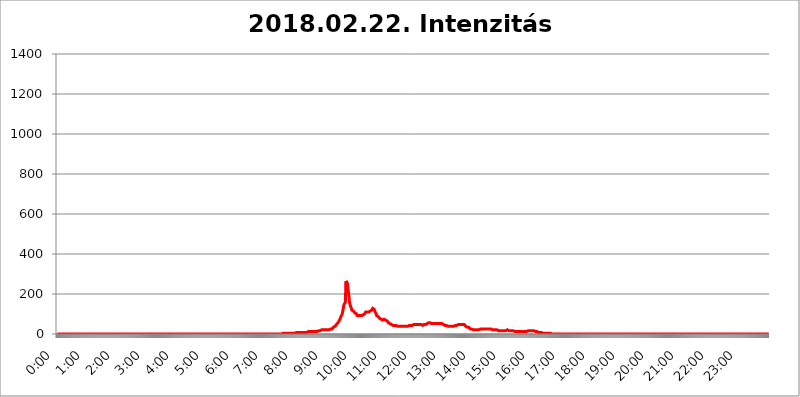
| Category | 2018.02.22. Intenzitás [W/m^2] |
|---|---|
| 0.0 | 0 |
| 0.0006944444444444445 | 0 |
| 0.001388888888888889 | 0 |
| 0.0020833333333333333 | 0 |
| 0.002777777777777778 | 0 |
| 0.003472222222222222 | 0 |
| 0.004166666666666667 | 0 |
| 0.004861111111111111 | 0 |
| 0.005555555555555556 | 0 |
| 0.0062499999999999995 | 0 |
| 0.006944444444444444 | 0 |
| 0.007638888888888889 | 0 |
| 0.008333333333333333 | 0 |
| 0.009027777777777779 | 0 |
| 0.009722222222222222 | 0 |
| 0.010416666666666666 | 0 |
| 0.011111111111111112 | 0 |
| 0.011805555555555555 | 0 |
| 0.012499999999999999 | 0 |
| 0.013194444444444444 | 0 |
| 0.013888888888888888 | 0 |
| 0.014583333333333332 | 0 |
| 0.015277777777777777 | 0 |
| 0.015972222222222224 | 0 |
| 0.016666666666666666 | 0 |
| 0.017361111111111112 | 0 |
| 0.018055555555555557 | 0 |
| 0.01875 | 0 |
| 0.019444444444444445 | 0 |
| 0.02013888888888889 | 0 |
| 0.020833333333333332 | 0 |
| 0.02152777777777778 | 0 |
| 0.022222222222222223 | 0 |
| 0.02291666666666667 | 0 |
| 0.02361111111111111 | 0 |
| 0.024305555555555556 | 0 |
| 0.024999999999999998 | 0 |
| 0.025694444444444447 | 0 |
| 0.02638888888888889 | 0 |
| 0.027083333333333334 | 0 |
| 0.027777777777777776 | 0 |
| 0.02847222222222222 | 0 |
| 0.029166666666666664 | 0 |
| 0.029861111111111113 | 0 |
| 0.030555555555555555 | 0 |
| 0.03125 | 0 |
| 0.03194444444444445 | 0 |
| 0.03263888888888889 | 0 |
| 0.03333333333333333 | 0 |
| 0.034027777777777775 | 0 |
| 0.034722222222222224 | 0 |
| 0.035416666666666666 | 0 |
| 0.036111111111111115 | 0 |
| 0.03680555555555556 | 0 |
| 0.0375 | 0 |
| 0.03819444444444444 | 0 |
| 0.03888888888888889 | 0 |
| 0.03958333333333333 | 0 |
| 0.04027777777777778 | 0 |
| 0.04097222222222222 | 0 |
| 0.041666666666666664 | 0 |
| 0.042361111111111106 | 0 |
| 0.04305555555555556 | 0 |
| 0.043750000000000004 | 0 |
| 0.044444444444444446 | 0 |
| 0.04513888888888889 | 0 |
| 0.04583333333333334 | 0 |
| 0.04652777777777778 | 0 |
| 0.04722222222222222 | 0 |
| 0.04791666666666666 | 0 |
| 0.04861111111111111 | 0 |
| 0.049305555555555554 | 0 |
| 0.049999999999999996 | 0 |
| 0.05069444444444445 | 0 |
| 0.051388888888888894 | 0 |
| 0.052083333333333336 | 0 |
| 0.05277777777777778 | 0 |
| 0.05347222222222222 | 0 |
| 0.05416666666666667 | 0 |
| 0.05486111111111111 | 0 |
| 0.05555555555555555 | 0 |
| 0.05625 | 0 |
| 0.05694444444444444 | 0 |
| 0.057638888888888885 | 0 |
| 0.05833333333333333 | 0 |
| 0.05902777777777778 | 0 |
| 0.059722222222222225 | 0 |
| 0.06041666666666667 | 0 |
| 0.061111111111111116 | 0 |
| 0.06180555555555556 | 0 |
| 0.0625 | 0 |
| 0.06319444444444444 | 0 |
| 0.06388888888888888 | 0 |
| 0.06458333333333334 | 0 |
| 0.06527777777777778 | 0 |
| 0.06597222222222222 | 0 |
| 0.06666666666666667 | 0 |
| 0.06736111111111111 | 0 |
| 0.06805555555555555 | 0 |
| 0.06874999999999999 | 0 |
| 0.06944444444444443 | 0 |
| 0.07013888888888889 | 0 |
| 0.07083333333333333 | 0 |
| 0.07152777777777779 | 0 |
| 0.07222222222222223 | 0 |
| 0.07291666666666667 | 0 |
| 0.07361111111111111 | 0 |
| 0.07430555555555556 | 0 |
| 0.075 | 0 |
| 0.07569444444444444 | 0 |
| 0.0763888888888889 | 0 |
| 0.07708333333333334 | 0 |
| 0.07777777777777778 | 0 |
| 0.07847222222222222 | 0 |
| 0.07916666666666666 | 0 |
| 0.0798611111111111 | 0 |
| 0.08055555555555556 | 0 |
| 0.08125 | 0 |
| 0.08194444444444444 | 0 |
| 0.08263888888888889 | 0 |
| 0.08333333333333333 | 0 |
| 0.08402777777777777 | 0 |
| 0.08472222222222221 | 0 |
| 0.08541666666666665 | 0 |
| 0.08611111111111112 | 0 |
| 0.08680555555555557 | 0 |
| 0.08750000000000001 | 0 |
| 0.08819444444444445 | 0 |
| 0.08888888888888889 | 0 |
| 0.08958333333333333 | 0 |
| 0.09027777777777778 | 0 |
| 0.09097222222222222 | 0 |
| 0.09166666666666667 | 0 |
| 0.09236111111111112 | 0 |
| 0.09305555555555556 | 0 |
| 0.09375 | 0 |
| 0.09444444444444444 | 0 |
| 0.09513888888888888 | 0 |
| 0.09583333333333333 | 0 |
| 0.09652777777777777 | 0 |
| 0.09722222222222222 | 0 |
| 0.09791666666666667 | 0 |
| 0.09861111111111111 | 0 |
| 0.09930555555555555 | 0 |
| 0.09999999999999999 | 0 |
| 0.10069444444444443 | 0 |
| 0.1013888888888889 | 0 |
| 0.10208333333333335 | 0 |
| 0.10277777777777779 | 0 |
| 0.10347222222222223 | 0 |
| 0.10416666666666667 | 0 |
| 0.10486111111111111 | 0 |
| 0.10555555555555556 | 0 |
| 0.10625 | 0 |
| 0.10694444444444444 | 0 |
| 0.1076388888888889 | 0 |
| 0.10833333333333334 | 0 |
| 0.10902777777777778 | 0 |
| 0.10972222222222222 | 0 |
| 0.1111111111111111 | 0 |
| 0.11180555555555556 | 0 |
| 0.11180555555555556 | 0 |
| 0.1125 | 0 |
| 0.11319444444444444 | 0 |
| 0.11388888888888889 | 0 |
| 0.11458333333333333 | 0 |
| 0.11527777777777777 | 0 |
| 0.11597222222222221 | 0 |
| 0.11666666666666665 | 0 |
| 0.1173611111111111 | 0 |
| 0.11805555555555557 | 0 |
| 0.11944444444444445 | 0 |
| 0.12013888888888889 | 0 |
| 0.12083333333333333 | 0 |
| 0.12152777777777778 | 0 |
| 0.12222222222222223 | 0 |
| 0.12291666666666667 | 0 |
| 0.12291666666666667 | 0 |
| 0.12361111111111112 | 0 |
| 0.12430555555555556 | 0 |
| 0.125 | 0 |
| 0.12569444444444444 | 0 |
| 0.12638888888888888 | 0 |
| 0.12708333333333333 | 0 |
| 0.16875 | 0 |
| 0.12847222222222224 | 0 |
| 0.12916666666666668 | 0 |
| 0.12986111111111112 | 0 |
| 0.13055555555555556 | 0 |
| 0.13125 | 0 |
| 0.13194444444444445 | 0 |
| 0.1326388888888889 | 0 |
| 0.13333333333333333 | 0 |
| 0.13402777777777777 | 0 |
| 0.13402777777777777 | 0 |
| 0.13472222222222222 | 0 |
| 0.13541666666666666 | 0 |
| 0.1361111111111111 | 0 |
| 0.13749999999999998 | 0 |
| 0.13819444444444443 | 0 |
| 0.1388888888888889 | 0 |
| 0.13958333333333334 | 0 |
| 0.14027777777777778 | 0 |
| 0.14097222222222222 | 0 |
| 0.14166666666666666 | 0 |
| 0.1423611111111111 | 0 |
| 0.14305555555555557 | 0 |
| 0.14375000000000002 | 0 |
| 0.14444444444444446 | 0 |
| 0.1451388888888889 | 0 |
| 0.1451388888888889 | 0 |
| 0.14652777777777778 | 0 |
| 0.14722222222222223 | 0 |
| 0.14791666666666667 | 0 |
| 0.1486111111111111 | 0 |
| 0.14930555555555555 | 0 |
| 0.15 | 0 |
| 0.15069444444444444 | 0 |
| 0.15138888888888888 | 0 |
| 0.15208333333333332 | 0 |
| 0.15277777777777776 | 0 |
| 0.15347222222222223 | 0 |
| 0.15416666666666667 | 0 |
| 0.15486111111111112 | 0 |
| 0.15555555555555556 | 0 |
| 0.15625 | 0 |
| 0.15694444444444444 | 0 |
| 0.15763888888888888 | 0 |
| 0.15833333333333333 | 0 |
| 0.15902777777777777 | 0 |
| 0.15972222222222224 | 0 |
| 0.16041666666666668 | 0 |
| 0.16111111111111112 | 0 |
| 0.16180555555555556 | 0 |
| 0.1625 | 0 |
| 0.16319444444444445 | 0 |
| 0.1638888888888889 | 0 |
| 0.16458333333333333 | 0 |
| 0.16527777777777777 | 0 |
| 0.16597222222222222 | 0 |
| 0.16666666666666666 | 0 |
| 0.1673611111111111 | 0 |
| 0.16805555555555554 | 0 |
| 0.16874999999999998 | 0 |
| 0.16944444444444443 | 0 |
| 0.17013888888888887 | 0 |
| 0.1708333333333333 | 0 |
| 0.17152777777777775 | 0 |
| 0.17222222222222225 | 0 |
| 0.1729166666666667 | 0 |
| 0.17361111111111113 | 0 |
| 0.17430555555555557 | 0 |
| 0.17500000000000002 | 0 |
| 0.17569444444444446 | 0 |
| 0.1763888888888889 | 0 |
| 0.17708333333333334 | 0 |
| 0.17777777777777778 | 0 |
| 0.17847222222222223 | 0 |
| 0.17916666666666667 | 0 |
| 0.1798611111111111 | 0 |
| 0.18055555555555555 | 0 |
| 0.18125 | 0 |
| 0.18194444444444444 | 0 |
| 0.1826388888888889 | 0 |
| 0.18333333333333335 | 0 |
| 0.1840277777777778 | 0 |
| 0.18472222222222223 | 0 |
| 0.18541666666666667 | 0 |
| 0.18611111111111112 | 0 |
| 0.18680555555555556 | 0 |
| 0.1875 | 0 |
| 0.18819444444444444 | 0 |
| 0.18888888888888888 | 0 |
| 0.18958333333333333 | 0 |
| 0.19027777777777777 | 0 |
| 0.1909722222222222 | 0 |
| 0.19166666666666665 | 0 |
| 0.19236111111111112 | 0 |
| 0.19305555555555554 | 0 |
| 0.19375 | 0 |
| 0.19444444444444445 | 0 |
| 0.1951388888888889 | 0 |
| 0.19583333333333333 | 0 |
| 0.19652777777777777 | 0 |
| 0.19722222222222222 | 0 |
| 0.19791666666666666 | 0 |
| 0.1986111111111111 | 0 |
| 0.19930555555555554 | 0 |
| 0.19999999999999998 | 0 |
| 0.20069444444444443 | 0 |
| 0.20138888888888887 | 0 |
| 0.2020833333333333 | 0 |
| 0.2027777777777778 | 0 |
| 0.2034722222222222 | 0 |
| 0.2041666666666667 | 0 |
| 0.20486111111111113 | 0 |
| 0.20555555555555557 | 0 |
| 0.20625000000000002 | 0 |
| 0.20694444444444446 | 0 |
| 0.2076388888888889 | 0 |
| 0.20833333333333334 | 0 |
| 0.20902777777777778 | 0 |
| 0.20972222222222223 | 0 |
| 0.21041666666666667 | 0 |
| 0.2111111111111111 | 0 |
| 0.21180555555555555 | 0 |
| 0.2125 | 0 |
| 0.21319444444444444 | 0 |
| 0.2138888888888889 | 0 |
| 0.21458333333333335 | 0 |
| 0.2152777777777778 | 0 |
| 0.21597222222222223 | 0 |
| 0.21666666666666667 | 0 |
| 0.21736111111111112 | 0 |
| 0.21805555555555556 | 0 |
| 0.21875 | 0 |
| 0.21944444444444444 | 0 |
| 0.22013888888888888 | 0 |
| 0.22083333333333333 | 0 |
| 0.22152777777777777 | 0 |
| 0.2222222222222222 | 0 |
| 0.22291666666666665 | 0 |
| 0.2236111111111111 | 0 |
| 0.22430555555555556 | 0 |
| 0.225 | 0 |
| 0.22569444444444445 | 0 |
| 0.2263888888888889 | 0 |
| 0.22708333333333333 | 0 |
| 0.22777777777777777 | 0 |
| 0.22847222222222222 | 0 |
| 0.22916666666666666 | 0 |
| 0.2298611111111111 | 0 |
| 0.23055555555555554 | 0 |
| 0.23124999999999998 | 0 |
| 0.23194444444444443 | 0 |
| 0.23263888888888887 | 0 |
| 0.2333333333333333 | 0 |
| 0.2340277777777778 | 0 |
| 0.2347222222222222 | 0 |
| 0.2354166666666667 | 0 |
| 0.23611111111111113 | 0 |
| 0.23680555555555557 | 0 |
| 0.23750000000000002 | 0 |
| 0.23819444444444446 | 0 |
| 0.2388888888888889 | 0 |
| 0.23958333333333334 | 0 |
| 0.24027777777777778 | 0 |
| 0.24097222222222223 | 0 |
| 0.24166666666666667 | 0 |
| 0.2423611111111111 | 0 |
| 0.24305555555555555 | 0 |
| 0.24375 | 0 |
| 0.24444444444444446 | 0 |
| 0.24513888888888888 | 0 |
| 0.24583333333333335 | 0 |
| 0.2465277777777778 | 0 |
| 0.24722222222222223 | 0 |
| 0.24791666666666667 | 0 |
| 0.24861111111111112 | 0 |
| 0.24930555555555556 | 0 |
| 0.25 | 0 |
| 0.25069444444444444 | 0 |
| 0.2513888888888889 | 0 |
| 0.2520833333333333 | 0 |
| 0.25277777777777777 | 0 |
| 0.2534722222222222 | 0 |
| 0.25416666666666665 | 0 |
| 0.2548611111111111 | 0 |
| 0.2555555555555556 | 0 |
| 0.25625000000000003 | 0 |
| 0.2569444444444445 | 0 |
| 0.2576388888888889 | 0 |
| 0.25833333333333336 | 0 |
| 0.2590277777777778 | 0 |
| 0.25972222222222224 | 0 |
| 0.2604166666666667 | 0 |
| 0.2611111111111111 | 0 |
| 0.26180555555555557 | 0 |
| 0.2625 | 0 |
| 0.26319444444444445 | 0 |
| 0.2638888888888889 | 0 |
| 0.26458333333333334 | 0 |
| 0.2652777777777778 | 0 |
| 0.2659722222222222 | 0 |
| 0.26666666666666666 | 0 |
| 0.2673611111111111 | 0 |
| 0.26805555555555555 | 0 |
| 0.26875 | 0 |
| 0.26944444444444443 | 0 |
| 0.2701388888888889 | 0 |
| 0.2708333333333333 | 0 |
| 0.27152777777777776 | 0 |
| 0.2722222222222222 | 0 |
| 0.27291666666666664 | 0 |
| 0.2736111111111111 | 0 |
| 0.2743055555555555 | 0 |
| 0.27499999999999997 | 0 |
| 0.27569444444444446 | 0 |
| 0.27638888888888885 | 0 |
| 0.27708333333333335 | 0 |
| 0.2777777777777778 | 0 |
| 0.27847222222222223 | 0 |
| 0.2791666666666667 | 0 |
| 0.2798611111111111 | 0 |
| 0.28055555555555556 | 0 |
| 0.28125 | 0 |
| 0.28194444444444444 | 0 |
| 0.2826388888888889 | 0 |
| 0.2833333333333333 | 0 |
| 0.28402777777777777 | 0 |
| 0.2847222222222222 | 0 |
| 0.28541666666666665 | 0 |
| 0.28611111111111115 | 0 |
| 0.28680555555555554 | 0 |
| 0.28750000000000003 | 0 |
| 0.2881944444444445 | 0 |
| 0.2888888888888889 | 0 |
| 0.28958333333333336 | 0 |
| 0.2902777777777778 | 0 |
| 0.29097222222222224 | 0 |
| 0.2916666666666667 | 0 |
| 0.2923611111111111 | 0 |
| 0.29305555555555557 | 0 |
| 0.29375 | 0 |
| 0.29444444444444445 | 0 |
| 0.2951388888888889 | 0 |
| 0.29583333333333334 | 0 |
| 0.2965277777777778 | 0 |
| 0.2972222222222222 | 0 |
| 0.29791666666666666 | 0 |
| 0.2986111111111111 | 0 |
| 0.29930555555555555 | 0 |
| 0.3 | 0 |
| 0.30069444444444443 | 0 |
| 0.3013888888888889 | 0 |
| 0.3020833333333333 | 0 |
| 0.30277777777777776 | 0 |
| 0.3034722222222222 | 0 |
| 0.30416666666666664 | 0 |
| 0.3048611111111111 | 0 |
| 0.3055555555555555 | 0 |
| 0.30624999999999997 | 0 |
| 0.3069444444444444 | 0 |
| 0.3076388888888889 | 0 |
| 0.30833333333333335 | 0 |
| 0.3090277777777778 | 0 |
| 0.30972222222222223 | 0 |
| 0.3104166666666667 | 0 |
| 0.3111111111111111 | 0 |
| 0.31180555555555556 | 0 |
| 0.3125 | 0 |
| 0.31319444444444444 | 0 |
| 0.3138888888888889 | 0 |
| 0.3145833333333333 | 0 |
| 0.31527777777777777 | 3.525 |
| 0.3159722222222222 | 0 |
| 0.31666666666666665 | 3.525 |
| 0.31736111111111115 | 3.525 |
| 0.31805555555555554 | 3.525 |
| 0.31875000000000003 | 3.525 |
| 0.3194444444444445 | 3.525 |
| 0.3201388888888889 | 3.525 |
| 0.32083333333333336 | 3.525 |
| 0.3215277777777778 | 3.525 |
| 0.32222222222222224 | 3.525 |
| 0.3229166666666667 | 3.525 |
| 0.3236111111111111 | 3.525 |
| 0.32430555555555557 | 3.525 |
| 0.325 | 3.525 |
| 0.32569444444444445 | 3.525 |
| 0.3263888888888889 | 3.525 |
| 0.32708333333333334 | 3.525 |
| 0.3277777777777778 | 3.525 |
| 0.3284722222222222 | 3.525 |
| 0.32916666666666666 | 3.525 |
| 0.3298611111111111 | 3.525 |
| 0.33055555555555555 | 3.525 |
| 0.33125 | 3.525 |
| 0.33194444444444443 | 3.525 |
| 0.3326388888888889 | 3.525 |
| 0.3333333333333333 | 3.525 |
| 0.3340277777777778 | 3.525 |
| 0.3347222222222222 | 3.525 |
| 0.3354166666666667 | 7.887 |
| 0.3361111111111111 | 7.887 |
| 0.3368055555555556 | 7.887 |
| 0.33749999999999997 | 7.887 |
| 0.33819444444444446 | 7.887 |
| 0.33888888888888885 | 7.887 |
| 0.33958333333333335 | 7.887 |
| 0.34027777777777773 | 7.887 |
| 0.34097222222222223 | 7.887 |
| 0.3416666666666666 | 7.887 |
| 0.3423611111111111 | 7.887 |
| 0.3430555555555555 | 7.887 |
| 0.34375 | 7.887 |
| 0.3444444444444445 | 7.887 |
| 0.3451388888888889 | 7.887 |
| 0.3458333333333334 | 7.887 |
| 0.34652777777777777 | 7.887 |
| 0.34722222222222227 | 7.887 |
| 0.34791666666666665 | 7.887 |
| 0.34861111111111115 | 7.887 |
| 0.34930555555555554 | 7.887 |
| 0.35000000000000003 | 7.887 |
| 0.3506944444444444 | 7.887 |
| 0.3513888888888889 | 12.257 |
| 0.3520833333333333 | 12.257 |
| 0.3527777777777778 | 12.257 |
| 0.3534722222222222 | 12.257 |
| 0.3541666666666667 | 12.257 |
| 0.3548611111111111 | 12.257 |
| 0.35555555555555557 | 12.257 |
| 0.35625 | 12.257 |
| 0.35694444444444445 | 12.257 |
| 0.3576388888888889 | 12.257 |
| 0.35833333333333334 | 12.257 |
| 0.3590277777777778 | 12.257 |
| 0.3597222222222222 | 12.257 |
| 0.36041666666666666 | 12.257 |
| 0.3611111111111111 | 12.257 |
| 0.36180555555555555 | 12.257 |
| 0.3625 | 12.257 |
| 0.36319444444444443 | 12.257 |
| 0.3638888888888889 | 12.257 |
| 0.3645833333333333 | 12.257 |
| 0.3652777777777778 | 12.257 |
| 0.3659722222222222 | 16.636 |
| 0.3666666666666667 | 16.636 |
| 0.3673611111111111 | 16.636 |
| 0.3680555555555556 | 16.636 |
| 0.36874999999999997 | 16.636 |
| 0.36944444444444446 | 21.024 |
| 0.37013888888888885 | 21.024 |
| 0.37083333333333335 | 21.024 |
| 0.37152777777777773 | 21.024 |
| 0.37222222222222223 | 21.024 |
| 0.3729166666666666 | 21.024 |
| 0.3736111111111111 | 21.024 |
| 0.3743055555555555 | 21.024 |
| 0.375 | 21.024 |
| 0.3756944444444445 | 21.024 |
| 0.3763888888888889 | 21.024 |
| 0.3770833333333334 | 21.024 |
| 0.37777777777777777 | 21.024 |
| 0.37847222222222227 | 21.024 |
| 0.37916666666666665 | 21.024 |
| 0.37986111111111115 | 21.024 |
| 0.38055555555555554 | 21.024 |
| 0.38125000000000003 | 21.024 |
| 0.3819444444444444 | 21.024 |
| 0.3826388888888889 | 21.024 |
| 0.3833333333333333 | 25.419 |
| 0.3840277777777778 | 25.419 |
| 0.3847222222222222 | 25.419 |
| 0.3854166666666667 | 25.419 |
| 0.3861111111111111 | 29.823 |
| 0.38680555555555557 | 29.823 |
| 0.3875 | 34.234 |
| 0.38819444444444445 | 34.234 |
| 0.3888888888888889 | 38.653 |
| 0.38958333333333334 | 38.653 |
| 0.3902777777777778 | 43.079 |
| 0.3909722222222222 | 43.079 |
| 0.39166666666666666 | 47.511 |
| 0.3923611111111111 | 47.511 |
| 0.39305555555555555 | 51.951 |
| 0.39375 | 56.398 |
| 0.39444444444444443 | 56.398 |
| 0.3951388888888889 | 65.31 |
| 0.3958333333333333 | 69.775 |
| 0.3965277777777778 | 74.246 |
| 0.3972222222222222 | 78.722 |
| 0.3979166666666667 | 87.692 |
| 0.3986111111111111 | 92.184 |
| 0.3993055555555556 | 96.682 |
| 0.39999999999999997 | 105.69 |
| 0.40069444444444446 | 119.235 |
| 0.40138888888888885 | 132.814 |
| 0.40208333333333335 | 146.423 |
| 0.40277777777777773 | 146.423 |
| 0.40347222222222223 | 141.884 |
| 0.4041666666666666 | 160.056 |
| 0.4048611111111111 | 264.932 |
| 0.4055555555555555 | 260.373 |
| 0.40625 | 260.373 |
| 0.4069444444444445 | 251.251 |
| 0.4076388888888889 | 233 |
| 0.4083333333333334 | 210.182 |
| 0.40902777777777777 | 191.937 |
| 0.40972222222222227 | 164.605 |
| 0.41041666666666665 | 150.964 |
| 0.41111111111111115 | 141.884 |
| 0.41180555555555554 | 137.347 |
| 0.41250000000000003 | 128.284 |
| 0.4131944444444444 | 119.235 |
| 0.4138888888888889 | 119.235 |
| 0.4145833333333333 | 114.716 |
| 0.4152777777777778 | 114.716 |
| 0.4159722222222222 | 110.201 |
| 0.4166666666666667 | 110.201 |
| 0.4173611111111111 | 105.69 |
| 0.41805555555555557 | 105.69 |
| 0.41875 | 101.184 |
| 0.41944444444444445 | 101.184 |
| 0.4201388888888889 | 96.682 |
| 0.42083333333333334 | 92.184 |
| 0.4215277777777778 | 92.184 |
| 0.4222222222222222 | 92.184 |
| 0.42291666666666666 | 92.184 |
| 0.4236111111111111 | 92.184 |
| 0.42430555555555555 | 92.184 |
| 0.425 | 92.184 |
| 0.42569444444444443 | 92.184 |
| 0.4263888888888889 | 92.184 |
| 0.4270833333333333 | 92.184 |
| 0.4277777777777778 | 92.184 |
| 0.4284722222222222 | 92.184 |
| 0.4291666666666667 | 96.682 |
| 0.4298611111111111 | 101.184 |
| 0.4305555555555556 | 101.184 |
| 0.43124999999999997 | 101.184 |
| 0.43194444444444446 | 105.69 |
| 0.43263888888888885 | 110.201 |
| 0.43333333333333335 | 110.201 |
| 0.43402777777777773 | 110.201 |
| 0.43472222222222223 | 110.201 |
| 0.4354166666666666 | 110.201 |
| 0.4361111111111111 | 110.201 |
| 0.4368055555555555 | 110.201 |
| 0.4375 | 114.716 |
| 0.4381944444444445 | 114.716 |
| 0.4388888888888889 | 114.716 |
| 0.4395833333333334 | 114.716 |
| 0.44027777777777777 | 119.235 |
| 0.44097222222222227 | 119.235 |
| 0.44166666666666665 | 123.758 |
| 0.44236111111111115 | 128.284 |
| 0.44305555555555554 | 128.284 |
| 0.44375000000000003 | 128.284 |
| 0.4444444444444444 | 123.758 |
| 0.4451388888888889 | 119.235 |
| 0.4458333333333333 | 110.201 |
| 0.4465277777777778 | 105.69 |
| 0.4472222222222222 | 101.184 |
| 0.4479166666666667 | 92.184 |
| 0.4486111111111111 | 92.184 |
| 0.44930555555555557 | 87.692 |
| 0.45 | 87.692 |
| 0.45069444444444445 | 83.205 |
| 0.4513888888888889 | 83.205 |
| 0.45208333333333334 | 78.722 |
| 0.4527777777777778 | 78.722 |
| 0.4534722222222222 | 78.722 |
| 0.45416666666666666 | 74.246 |
| 0.4548611111111111 | 74.246 |
| 0.45555555555555555 | 69.775 |
| 0.45625 | 69.775 |
| 0.45694444444444443 | 69.775 |
| 0.4576388888888889 | 69.775 |
| 0.4583333333333333 | 74.246 |
| 0.4590277777777778 | 74.246 |
| 0.4597222222222222 | 74.246 |
| 0.4604166666666667 | 69.775 |
| 0.4611111111111111 | 69.775 |
| 0.4618055555555556 | 65.31 |
| 0.46249999999999997 | 65.31 |
| 0.46319444444444446 | 65.31 |
| 0.46388888888888885 | 60.85 |
| 0.46458333333333335 | 56.398 |
| 0.46527777777777773 | 56.398 |
| 0.46597222222222223 | 56.398 |
| 0.4666666666666666 | 51.951 |
| 0.4673611111111111 | 51.951 |
| 0.4680555555555555 | 47.511 |
| 0.46875 | 47.511 |
| 0.4694444444444445 | 47.511 |
| 0.4701388888888889 | 43.079 |
| 0.4708333333333334 | 43.079 |
| 0.47152777777777777 | 43.079 |
| 0.47222222222222227 | 43.079 |
| 0.47291666666666665 | 43.079 |
| 0.47361111111111115 | 43.079 |
| 0.47430555555555554 | 43.079 |
| 0.47500000000000003 | 43.079 |
| 0.4756944444444444 | 38.653 |
| 0.4763888888888889 | 38.653 |
| 0.4770833333333333 | 38.653 |
| 0.4777777777777778 | 38.653 |
| 0.4784722222222222 | 38.653 |
| 0.4791666666666667 | 38.653 |
| 0.4798611111111111 | 38.653 |
| 0.48055555555555557 | 38.653 |
| 0.48125 | 38.653 |
| 0.48194444444444445 | 38.653 |
| 0.4826388888888889 | 38.653 |
| 0.48333333333333334 | 38.653 |
| 0.4840277777777778 | 38.653 |
| 0.4847222222222222 | 38.653 |
| 0.48541666666666666 | 38.653 |
| 0.4861111111111111 | 38.653 |
| 0.48680555555555555 | 38.653 |
| 0.4875 | 38.653 |
| 0.48819444444444443 | 38.653 |
| 0.4888888888888889 | 38.653 |
| 0.4895833333333333 | 38.653 |
| 0.4902777777777778 | 38.653 |
| 0.4909722222222222 | 38.653 |
| 0.4916666666666667 | 38.653 |
| 0.4923611111111111 | 38.653 |
| 0.4930555555555556 | 38.653 |
| 0.49374999999999997 | 43.079 |
| 0.49444444444444446 | 43.079 |
| 0.49513888888888885 | 43.079 |
| 0.49583333333333335 | 43.079 |
| 0.49652777777777773 | 43.079 |
| 0.49722222222222223 | 43.079 |
| 0.4979166666666666 | 43.079 |
| 0.4986111111111111 | 43.079 |
| 0.4993055555555555 | 47.511 |
| 0.5 | 47.511 |
| 0.5006944444444444 | 47.511 |
| 0.5013888888888889 | 47.511 |
| 0.5020833333333333 | 47.511 |
| 0.5027777777777778 | 47.511 |
| 0.5034722222222222 | 47.511 |
| 0.5041666666666667 | 47.511 |
| 0.5048611111111111 | 47.511 |
| 0.5055555555555555 | 47.511 |
| 0.50625 | 47.511 |
| 0.5069444444444444 | 47.511 |
| 0.5076388888888889 | 47.511 |
| 0.5083333333333333 | 47.511 |
| 0.5090277777777777 | 47.511 |
| 0.5097222222222222 | 47.511 |
| 0.5104166666666666 | 47.511 |
| 0.5111111111111112 | 47.511 |
| 0.5118055555555555 | 43.079 |
| 0.5125000000000001 | 43.079 |
| 0.5131944444444444 | 43.079 |
| 0.513888888888889 | 43.079 |
| 0.5145833333333333 | 47.511 |
| 0.5152777777777778 | 47.511 |
| 0.5159722222222222 | 47.511 |
| 0.5166666666666667 | 47.511 |
| 0.517361111111111 | 51.951 |
| 0.5180555555555556 | 51.951 |
| 0.5187499999999999 | 51.951 |
| 0.5194444444444445 | 56.398 |
| 0.5201388888888888 | 56.398 |
| 0.5208333333333334 | 56.398 |
| 0.5215277777777778 | 56.398 |
| 0.5222222222222223 | 56.398 |
| 0.5229166666666667 | 56.398 |
| 0.5236111111111111 | 56.398 |
| 0.5243055555555556 | 56.398 |
| 0.525 | 51.951 |
| 0.5256944444444445 | 51.951 |
| 0.5263888888888889 | 51.951 |
| 0.5270833333333333 | 51.951 |
| 0.5277777777777778 | 51.951 |
| 0.5284722222222222 | 47.511 |
| 0.5291666666666667 | 51.951 |
| 0.5298611111111111 | 51.951 |
| 0.5305555555555556 | 47.511 |
| 0.53125 | 51.951 |
| 0.5319444444444444 | 51.951 |
| 0.5326388888888889 | 51.951 |
| 0.5333333333333333 | 51.951 |
| 0.5340277777777778 | 51.951 |
| 0.5347222222222222 | 51.951 |
| 0.5354166666666667 | 51.951 |
| 0.5361111111111111 | 51.951 |
| 0.5368055555555555 | 51.951 |
| 0.5375 | 51.951 |
| 0.5381944444444444 | 51.951 |
| 0.5388888888888889 | 51.951 |
| 0.5395833333333333 | 51.951 |
| 0.5402777777777777 | 51.951 |
| 0.5409722222222222 | 47.511 |
| 0.5416666666666666 | 47.511 |
| 0.5423611111111112 | 47.511 |
| 0.5430555555555555 | 47.511 |
| 0.5437500000000001 | 43.079 |
| 0.5444444444444444 | 43.079 |
| 0.545138888888889 | 43.079 |
| 0.5458333333333333 | 43.079 |
| 0.5465277777777778 | 43.079 |
| 0.5472222222222222 | 43.079 |
| 0.5479166666666667 | 38.653 |
| 0.548611111111111 | 43.079 |
| 0.5493055555555556 | 38.653 |
| 0.5499999999999999 | 38.653 |
| 0.5506944444444445 | 38.653 |
| 0.5513888888888888 | 38.653 |
| 0.5520833333333334 | 38.653 |
| 0.5527777777777778 | 38.653 |
| 0.5534722222222223 | 38.653 |
| 0.5541666666666667 | 38.653 |
| 0.5548611111111111 | 38.653 |
| 0.5555555555555556 | 38.653 |
| 0.55625 | 38.653 |
| 0.5569444444444445 | 38.653 |
| 0.5576388888888889 | 38.653 |
| 0.5583333333333333 | 43.079 |
| 0.5590277777777778 | 43.079 |
| 0.5597222222222222 | 43.079 |
| 0.5604166666666667 | 43.079 |
| 0.5611111111111111 | 47.511 |
| 0.5618055555555556 | 47.511 |
| 0.5625 | 47.511 |
| 0.5631944444444444 | 47.511 |
| 0.5638888888888889 | 47.511 |
| 0.5645833333333333 | 47.511 |
| 0.5652777777777778 | 47.511 |
| 0.5659722222222222 | 47.511 |
| 0.5666666666666667 | 47.511 |
| 0.5673611111111111 | 47.511 |
| 0.5680555555555555 | 47.511 |
| 0.56875 | 47.511 |
| 0.5694444444444444 | 47.511 |
| 0.5701388888888889 | 47.511 |
| 0.5708333333333333 | 47.511 |
| 0.5715277777777777 | 43.079 |
| 0.5722222222222222 | 43.079 |
| 0.5729166666666666 | 38.653 |
| 0.5736111111111112 | 38.653 |
| 0.5743055555555555 | 34.234 |
| 0.5750000000000001 | 34.234 |
| 0.5756944444444444 | 34.234 |
| 0.576388888888889 | 34.234 |
| 0.5770833333333333 | 34.234 |
| 0.5777777777777778 | 29.823 |
| 0.5784722222222222 | 29.823 |
| 0.5791666666666667 | 25.419 |
| 0.579861111111111 | 25.419 |
| 0.5805555555555556 | 25.419 |
| 0.5812499999999999 | 25.419 |
| 0.5819444444444445 | 21.024 |
| 0.5826388888888888 | 21.024 |
| 0.5833333333333334 | 21.024 |
| 0.5840277777777778 | 21.024 |
| 0.5847222222222223 | 21.024 |
| 0.5854166666666667 | 21.024 |
| 0.5861111111111111 | 21.024 |
| 0.5868055555555556 | 25.419 |
| 0.5875 | 21.024 |
| 0.5881944444444445 | 21.024 |
| 0.5888888888888889 | 21.024 |
| 0.5895833333333333 | 21.024 |
| 0.5902777777777778 | 21.024 |
| 0.5909722222222222 | 21.024 |
| 0.5916666666666667 | 21.024 |
| 0.5923611111111111 | 21.024 |
| 0.5930555555555556 | 25.419 |
| 0.59375 | 25.419 |
| 0.5944444444444444 | 25.419 |
| 0.5951388888888889 | 25.419 |
| 0.5958333333333333 | 25.419 |
| 0.5965277777777778 | 25.419 |
| 0.5972222222222222 | 25.419 |
| 0.5979166666666667 | 25.419 |
| 0.5986111111111111 | 25.419 |
| 0.5993055555555555 | 25.419 |
| 0.6 | 25.419 |
| 0.6006944444444444 | 25.419 |
| 0.6013888888888889 | 25.419 |
| 0.6020833333333333 | 25.419 |
| 0.6027777777777777 | 25.419 |
| 0.6034722222222222 | 25.419 |
| 0.6041666666666666 | 25.419 |
| 0.6048611111111112 | 25.419 |
| 0.6055555555555555 | 25.419 |
| 0.6062500000000001 | 25.419 |
| 0.6069444444444444 | 25.419 |
| 0.607638888888889 | 25.419 |
| 0.6083333333333333 | 25.419 |
| 0.6090277777777778 | 21.024 |
| 0.6097222222222222 | 21.024 |
| 0.6104166666666667 | 21.024 |
| 0.611111111111111 | 21.024 |
| 0.6118055555555556 | 21.024 |
| 0.6124999999999999 | 21.024 |
| 0.6131944444444445 | 21.024 |
| 0.6138888888888888 | 21.024 |
| 0.6145833333333334 | 21.024 |
| 0.6152777777777778 | 21.024 |
| 0.6159722222222223 | 21.024 |
| 0.6166666666666667 | 21.024 |
| 0.6173611111111111 | 16.636 |
| 0.6180555555555556 | 16.636 |
| 0.61875 | 16.636 |
| 0.6194444444444445 | 16.636 |
| 0.6201388888888889 | 16.636 |
| 0.6208333333333333 | 16.636 |
| 0.6215277777777778 | 12.257 |
| 0.6222222222222222 | 12.257 |
| 0.6229166666666667 | 16.636 |
| 0.6236111111111111 | 16.636 |
| 0.6243055555555556 | 12.257 |
| 0.625 | 16.636 |
| 0.6256944444444444 | 16.636 |
| 0.6263888888888889 | 16.636 |
| 0.6270833333333333 | 16.636 |
| 0.6277777777777778 | 16.636 |
| 0.6284722222222222 | 16.636 |
| 0.6291666666666667 | 16.636 |
| 0.6298611111111111 | 16.636 |
| 0.6305555555555555 | 16.636 |
| 0.63125 | 21.024 |
| 0.6319444444444444 | 21.024 |
| 0.6326388888888889 | 16.636 |
| 0.6333333333333333 | 16.636 |
| 0.6340277777777777 | 16.636 |
| 0.6347222222222222 | 16.636 |
| 0.6354166666666666 | 16.636 |
| 0.6361111111111112 | 16.636 |
| 0.6368055555555555 | 16.636 |
| 0.6375000000000001 | 16.636 |
| 0.6381944444444444 | 16.636 |
| 0.638888888888889 | 16.636 |
| 0.6395833333333333 | 16.636 |
| 0.6402777777777778 | 16.636 |
| 0.6409722222222222 | 16.636 |
| 0.6416666666666667 | 12.257 |
| 0.642361111111111 | 12.257 |
| 0.6430555555555556 | 12.257 |
| 0.6437499999999999 | 12.257 |
| 0.6444444444444445 | 12.257 |
| 0.6451388888888888 | 12.257 |
| 0.6458333333333334 | 12.257 |
| 0.6465277777777778 | 12.257 |
| 0.6472222222222223 | 12.257 |
| 0.6479166666666667 | 12.257 |
| 0.6486111111111111 | 12.257 |
| 0.6493055555555556 | 12.257 |
| 0.65 | 12.257 |
| 0.6506944444444445 | 12.257 |
| 0.6513888888888889 | 12.257 |
| 0.6520833333333333 | 12.257 |
| 0.6527777777777778 | 12.257 |
| 0.6534722222222222 | 12.257 |
| 0.6541666666666667 | 12.257 |
| 0.6548611111111111 | 12.257 |
| 0.6555555555555556 | 12.257 |
| 0.65625 | 12.257 |
| 0.6569444444444444 | 12.257 |
| 0.6576388888888889 | 12.257 |
| 0.6583333333333333 | 12.257 |
| 0.6590277777777778 | 12.257 |
| 0.6597222222222222 | 16.636 |
| 0.6604166666666667 | 16.636 |
| 0.6611111111111111 | 16.636 |
| 0.6618055555555555 | 16.636 |
| 0.6625 | 16.636 |
| 0.6631944444444444 | 16.636 |
| 0.6638888888888889 | 16.636 |
| 0.6645833333333333 | 16.636 |
| 0.6652777777777777 | 16.636 |
| 0.6659722222222222 | 16.636 |
| 0.6666666666666666 | 16.636 |
| 0.6673611111111111 | 16.636 |
| 0.6680555555555556 | 16.636 |
| 0.6687500000000001 | 16.636 |
| 0.6694444444444444 | 12.257 |
| 0.6701388888888888 | 12.257 |
| 0.6708333333333334 | 12.257 |
| 0.6715277777777778 | 12.257 |
| 0.6722222222222222 | 12.257 |
| 0.6729166666666666 | 12.257 |
| 0.6736111111111112 | 12.257 |
| 0.6743055555555556 | 12.257 |
| 0.6749999999999999 | 7.887 |
| 0.6756944444444444 | 7.887 |
| 0.6763888888888889 | 7.887 |
| 0.6770833333333334 | 7.887 |
| 0.6777777777777777 | 7.887 |
| 0.6784722222222223 | 7.887 |
| 0.6791666666666667 | 7.887 |
| 0.6798611111111111 | 3.525 |
| 0.6805555555555555 | 3.525 |
| 0.68125 | 3.525 |
| 0.6819444444444445 | 3.525 |
| 0.6826388888888889 | 3.525 |
| 0.6833333333333332 | 3.525 |
| 0.6840277777777778 | 3.525 |
| 0.6847222222222222 | 3.525 |
| 0.6854166666666667 | 3.525 |
| 0.686111111111111 | 3.525 |
| 0.6868055555555556 | 3.525 |
| 0.6875 | 3.525 |
| 0.6881944444444444 | 3.525 |
| 0.688888888888889 | 0 |
| 0.6895833333333333 | 3.525 |
| 0.6902777777777778 | 3.525 |
| 0.6909722222222222 | 0 |
| 0.6916666666666668 | 3.525 |
| 0.6923611111111111 | 0 |
| 0.6930555555555555 | 0 |
| 0.69375 | 0 |
| 0.6944444444444445 | 0 |
| 0.6951388888888889 | 0 |
| 0.6958333333333333 | 0 |
| 0.6965277777777777 | 0 |
| 0.6972222222222223 | 0 |
| 0.6979166666666666 | 0 |
| 0.6986111111111111 | 0 |
| 0.6993055555555556 | 0 |
| 0.7000000000000001 | 0 |
| 0.7006944444444444 | 0 |
| 0.7013888888888888 | 0 |
| 0.7020833333333334 | 0 |
| 0.7027777777777778 | 0 |
| 0.7034722222222222 | 0 |
| 0.7041666666666666 | 0 |
| 0.7048611111111112 | 0 |
| 0.7055555555555556 | 0 |
| 0.7062499999999999 | 0 |
| 0.7069444444444444 | 0 |
| 0.7076388888888889 | 0 |
| 0.7083333333333334 | 0 |
| 0.7090277777777777 | 0 |
| 0.7097222222222223 | 0 |
| 0.7104166666666667 | 0 |
| 0.7111111111111111 | 0 |
| 0.7118055555555555 | 0 |
| 0.7125 | 0 |
| 0.7131944444444445 | 0 |
| 0.7138888888888889 | 0 |
| 0.7145833333333332 | 0 |
| 0.7152777777777778 | 0 |
| 0.7159722222222222 | 0 |
| 0.7166666666666667 | 0 |
| 0.717361111111111 | 0 |
| 0.7180555555555556 | 0 |
| 0.71875 | 0 |
| 0.7194444444444444 | 0 |
| 0.720138888888889 | 0 |
| 0.7208333333333333 | 0 |
| 0.7215277777777778 | 0 |
| 0.7222222222222222 | 0 |
| 0.7229166666666668 | 0 |
| 0.7236111111111111 | 0 |
| 0.7243055555555555 | 0 |
| 0.725 | 0 |
| 0.7256944444444445 | 0 |
| 0.7263888888888889 | 0 |
| 0.7270833333333333 | 0 |
| 0.7277777777777777 | 0 |
| 0.7284722222222223 | 0 |
| 0.7291666666666666 | 0 |
| 0.7298611111111111 | 0 |
| 0.7305555555555556 | 0 |
| 0.7312500000000001 | 0 |
| 0.7319444444444444 | 0 |
| 0.7326388888888888 | 0 |
| 0.7333333333333334 | 0 |
| 0.7340277777777778 | 0 |
| 0.7347222222222222 | 0 |
| 0.7354166666666666 | 0 |
| 0.7361111111111112 | 0 |
| 0.7368055555555556 | 0 |
| 0.7374999999999999 | 0 |
| 0.7381944444444444 | 0 |
| 0.7388888888888889 | 0 |
| 0.7395833333333334 | 0 |
| 0.7402777777777777 | 0 |
| 0.7409722222222223 | 0 |
| 0.7416666666666667 | 0 |
| 0.7423611111111111 | 0 |
| 0.7430555555555555 | 0 |
| 0.74375 | 0 |
| 0.7444444444444445 | 0 |
| 0.7451388888888889 | 0 |
| 0.7458333333333332 | 0 |
| 0.7465277777777778 | 0 |
| 0.7472222222222222 | 0 |
| 0.7479166666666667 | 0 |
| 0.748611111111111 | 0 |
| 0.7493055555555556 | 0 |
| 0.75 | 0 |
| 0.7506944444444444 | 0 |
| 0.751388888888889 | 0 |
| 0.7520833333333333 | 0 |
| 0.7527777777777778 | 0 |
| 0.7534722222222222 | 0 |
| 0.7541666666666668 | 0 |
| 0.7548611111111111 | 0 |
| 0.7555555555555555 | 0 |
| 0.75625 | 0 |
| 0.7569444444444445 | 0 |
| 0.7576388888888889 | 0 |
| 0.7583333333333333 | 0 |
| 0.7590277777777777 | 0 |
| 0.7597222222222223 | 0 |
| 0.7604166666666666 | 0 |
| 0.7611111111111111 | 0 |
| 0.7618055555555556 | 0 |
| 0.7625000000000001 | 0 |
| 0.7631944444444444 | 0 |
| 0.7638888888888888 | 0 |
| 0.7645833333333334 | 0 |
| 0.7652777777777778 | 0 |
| 0.7659722222222222 | 0 |
| 0.7666666666666666 | 0 |
| 0.7673611111111112 | 0 |
| 0.7680555555555556 | 0 |
| 0.7687499999999999 | 0 |
| 0.7694444444444444 | 0 |
| 0.7701388888888889 | 0 |
| 0.7708333333333334 | 0 |
| 0.7715277777777777 | 0 |
| 0.7722222222222223 | 0 |
| 0.7729166666666667 | 0 |
| 0.7736111111111111 | 0 |
| 0.7743055555555555 | 0 |
| 0.775 | 0 |
| 0.7756944444444445 | 0 |
| 0.7763888888888889 | 0 |
| 0.7770833333333332 | 0 |
| 0.7777777777777778 | 0 |
| 0.7784722222222222 | 0 |
| 0.7791666666666667 | 0 |
| 0.779861111111111 | 0 |
| 0.7805555555555556 | 0 |
| 0.78125 | 0 |
| 0.7819444444444444 | 0 |
| 0.782638888888889 | 0 |
| 0.7833333333333333 | 0 |
| 0.7840277777777778 | 0 |
| 0.7847222222222222 | 0 |
| 0.7854166666666668 | 0 |
| 0.7861111111111111 | 0 |
| 0.7868055555555555 | 0 |
| 0.7875 | 0 |
| 0.7881944444444445 | 0 |
| 0.7888888888888889 | 0 |
| 0.7895833333333333 | 0 |
| 0.7902777777777777 | 0 |
| 0.7909722222222223 | 0 |
| 0.7916666666666666 | 0 |
| 0.7923611111111111 | 0 |
| 0.7930555555555556 | 0 |
| 0.7937500000000001 | 0 |
| 0.7944444444444444 | 0 |
| 0.7951388888888888 | 0 |
| 0.7958333333333334 | 0 |
| 0.7965277777777778 | 0 |
| 0.7972222222222222 | 0 |
| 0.7979166666666666 | 0 |
| 0.7986111111111112 | 0 |
| 0.7993055555555556 | 0 |
| 0.7999999999999999 | 0 |
| 0.8006944444444444 | 0 |
| 0.8013888888888889 | 0 |
| 0.8020833333333334 | 0 |
| 0.8027777777777777 | 0 |
| 0.8034722222222223 | 0 |
| 0.8041666666666667 | 0 |
| 0.8048611111111111 | 0 |
| 0.8055555555555555 | 0 |
| 0.80625 | 0 |
| 0.8069444444444445 | 0 |
| 0.8076388888888889 | 0 |
| 0.8083333333333332 | 0 |
| 0.8090277777777778 | 0 |
| 0.8097222222222222 | 0 |
| 0.8104166666666667 | 0 |
| 0.811111111111111 | 0 |
| 0.8118055555555556 | 0 |
| 0.8125 | 0 |
| 0.8131944444444444 | 0 |
| 0.813888888888889 | 0 |
| 0.8145833333333333 | 0 |
| 0.8152777777777778 | 0 |
| 0.8159722222222222 | 0 |
| 0.8166666666666668 | 0 |
| 0.8173611111111111 | 0 |
| 0.8180555555555555 | 0 |
| 0.81875 | 0 |
| 0.8194444444444445 | 0 |
| 0.8201388888888889 | 0 |
| 0.8208333333333333 | 0 |
| 0.8215277777777777 | 0 |
| 0.8222222222222223 | 0 |
| 0.8229166666666666 | 0 |
| 0.8236111111111111 | 0 |
| 0.8243055555555556 | 0 |
| 0.8250000000000001 | 0 |
| 0.8256944444444444 | 0 |
| 0.8263888888888888 | 0 |
| 0.8270833333333334 | 0 |
| 0.8277777777777778 | 0 |
| 0.8284722222222222 | 0 |
| 0.8291666666666666 | 0 |
| 0.8298611111111112 | 0 |
| 0.8305555555555556 | 0 |
| 0.8312499999999999 | 0 |
| 0.8319444444444444 | 0 |
| 0.8326388888888889 | 0 |
| 0.8333333333333334 | 0 |
| 0.8340277777777777 | 0 |
| 0.8347222222222223 | 0 |
| 0.8354166666666667 | 0 |
| 0.8361111111111111 | 0 |
| 0.8368055555555555 | 0 |
| 0.8375 | 0 |
| 0.8381944444444445 | 0 |
| 0.8388888888888889 | 0 |
| 0.8395833333333332 | 0 |
| 0.8402777777777778 | 0 |
| 0.8409722222222222 | 0 |
| 0.8416666666666667 | 0 |
| 0.842361111111111 | 0 |
| 0.8430555555555556 | 0 |
| 0.84375 | 0 |
| 0.8444444444444444 | 0 |
| 0.845138888888889 | 0 |
| 0.8458333333333333 | 0 |
| 0.8465277777777778 | 0 |
| 0.8472222222222222 | 0 |
| 0.8479166666666668 | 0 |
| 0.8486111111111111 | 0 |
| 0.8493055555555555 | 0 |
| 0.85 | 0 |
| 0.8506944444444445 | 0 |
| 0.8513888888888889 | 0 |
| 0.8520833333333333 | 0 |
| 0.8527777777777777 | 0 |
| 0.8534722222222223 | 0 |
| 0.8541666666666666 | 0 |
| 0.8548611111111111 | 0 |
| 0.8555555555555556 | 0 |
| 0.8562500000000001 | 0 |
| 0.8569444444444444 | 0 |
| 0.8576388888888888 | 0 |
| 0.8583333333333334 | 0 |
| 0.8590277777777778 | 0 |
| 0.8597222222222222 | 0 |
| 0.8604166666666666 | 0 |
| 0.8611111111111112 | 0 |
| 0.8618055555555556 | 0 |
| 0.8624999999999999 | 0 |
| 0.8631944444444444 | 0 |
| 0.8638888888888889 | 0 |
| 0.8645833333333334 | 0 |
| 0.8652777777777777 | 0 |
| 0.8659722222222223 | 0 |
| 0.8666666666666667 | 0 |
| 0.8673611111111111 | 0 |
| 0.8680555555555555 | 0 |
| 0.86875 | 0 |
| 0.8694444444444445 | 0 |
| 0.8701388888888889 | 0 |
| 0.8708333333333332 | 0 |
| 0.8715277777777778 | 0 |
| 0.8722222222222222 | 0 |
| 0.8729166666666667 | 0 |
| 0.873611111111111 | 0 |
| 0.8743055555555556 | 0 |
| 0.875 | 0 |
| 0.8756944444444444 | 0 |
| 0.876388888888889 | 0 |
| 0.8770833333333333 | 0 |
| 0.8777777777777778 | 0 |
| 0.8784722222222222 | 0 |
| 0.8791666666666668 | 0 |
| 0.8798611111111111 | 0 |
| 0.8805555555555555 | 0 |
| 0.88125 | 0 |
| 0.8819444444444445 | 0 |
| 0.8826388888888889 | 0 |
| 0.8833333333333333 | 0 |
| 0.8840277777777777 | 0 |
| 0.8847222222222223 | 0 |
| 0.8854166666666666 | 0 |
| 0.8861111111111111 | 0 |
| 0.8868055555555556 | 0 |
| 0.8875000000000001 | 0 |
| 0.8881944444444444 | 0 |
| 0.8888888888888888 | 0 |
| 0.8895833333333334 | 0 |
| 0.8902777777777778 | 0 |
| 0.8909722222222222 | 0 |
| 0.8916666666666666 | 0 |
| 0.8923611111111112 | 0 |
| 0.8930555555555556 | 0 |
| 0.8937499999999999 | 0 |
| 0.8944444444444444 | 0 |
| 0.8951388888888889 | 0 |
| 0.8958333333333334 | 0 |
| 0.8965277777777777 | 0 |
| 0.8972222222222223 | 0 |
| 0.8979166666666667 | 0 |
| 0.8986111111111111 | 0 |
| 0.8993055555555555 | 0 |
| 0.9 | 0 |
| 0.9006944444444445 | 0 |
| 0.9013888888888889 | 0 |
| 0.9020833333333332 | 0 |
| 0.9027777777777778 | 0 |
| 0.9034722222222222 | 0 |
| 0.9041666666666667 | 0 |
| 0.904861111111111 | 0 |
| 0.9055555555555556 | 0 |
| 0.90625 | 0 |
| 0.9069444444444444 | 0 |
| 0.907638888888889 | 0 |
| 0.9083333333333333 | 0 |
| 0.9090277777777778 | 0 |
| 0.9097222222222222 | 0 |
| 0.9104166666666668 | 0 |
| 0.9111111111111111 | 0 |
| 0.9118055555555555 | 0 |
| 0.9125 | 0 |
| 0.9131944444444445 | 0 |
| 0.9138888888888889 | 0 |
| 0.9145833333333333 | 0 |
| 0.9152777777777777 | 0 |
| 0.9159722222222223 | 0 |
| 0.9166666666666666 | 0 |
| 0.9173611111111111 | 0 |
| 0.9180555555555556 | 0 |
| 0.9187500000000001 | 0 |
| 0.9194444444444444 | 0 |
| 0.9201388888888888 | 0 |
| 0.9208333333333334 | 0 |
| 0.9215277777777778 | 0 |
| 0.9222222222222222 | 0 |
| 0.9229166666666666 | 0 |
| 0.9236111111111112 | 0 |
| 0.9243055555555556 | 0 |
| 0.9249999999999999 | 0 |
| 0.9256944444444444 | 0 |
| 0.9263888888888889 | 0 |
| 0.9270833333333334 | 0 |
| 0.9277777777777777 | 0 |
| 0.9284722222222223 | 0 |
| 0.9291666666666667 | 0 |
| 0.9298611111111111 | 0 |
| 0.9305555555555555 | 0 |
| 0.93125 | 0 |
| 0.9319444444444445 | 0 |
| 0.9326388888888889 | 0 |
| 0.9333333333333332 | 0 |
| 0.9340277777777778 | 0 |
| 0.9347222222222222 | 0 |
| 0.9354166666666667 | 0 |
| 0.936111111111111 | 0 |
| 0.9368055555555556 | 0 |
| 0.9375 | 0 |
| 0.9381944444444444 | 0 |
| 0.938888888888889 | 0 |
| 0.9395833333333333 | 0 |
| 0.9402777777777778 | 0 |
| 0.9409722222222222 | 0 |
| 0.9416666666666668 | 0 |
| 0.9423611111111111 | 0 |
| 0.9430555555555555 | 0 |
| 0.94375 | 0 |
| 0.9444444444444445 | 0 |
| 0.9451388888888889 | 0 |
| 0.9458333333333333 | 0 |
| 0.9465277777777777 | 0 |
| 0.9472222222222223 | 0 |
| 0.9479166666666666 | 0 |
| 0.9486111111111111 | 0 |
| 0.9493055555555556 | 0 |
| 0.9500000000000001 | 0 |
| 0.9506944444444444 | 0 |
| 0.9513888888888888 | 0 |
| 0.9520833333333334 | 0 |
| 0.9527777777777778 | 0 |
| 0.9534722222222222 | 0 |
| 0.9541666666666666 | 0 |
| 0.9548611111111112 | 0 |
| 0.9555555555555556 | 0 |
| 0.9562499999999999 | 0 |
| 0.9569444444444444 | 0 |
| 0.9576388888888889 | 0 |
| 0.9583333333333334 | 0 |
| 0.9590277777777777 | 0 |
| 0.9597222222222223 | 0 |
| 0.9604166666666667 | 0 |
| 0.9611111111111111 | 0 |
| 0.9618055555555555 | 0 |
| 0.9625 | 0 |
| 0.9631944444444445 | 0 |
| 0.9638888888888889 | 0 |
| 0.9645833333333332 | 0 |
| 0.9652777777777778 | 0 |
| 0.9659722222222222 | 0 |
| 0.9666666666666667 | 0 |
| 0.967361111111111 | 0 |
| 0.9680555555555556 | 0 |
| 0.96875 | 0 |
| 0.9694444444444444 | 0 |
| 0.970138888888889 | 0 |
| 0.9708333333333333 | 0 |
| 0.9715277777777778 | 0 |
| 0.9722222222222222 | 0 |
| 0.9729166666666668 | 0 |
| 0.9736111111111111 | 0 |
| 0.9743055555555555 | 0 |
| 0.975 | 0 |
| 0.9756944444444445 | 0 |
| 0.9763888888888889 | 0 |
| 0.9770833333333333 | 0 |
| 0.9777777777777777 | 0 |
| 0.9784722222222223 | 0 |
| 0.9791666666666666 | 0 |
| 0.9798611111111111 | 0 |
| 0.9805555555555556 | 0 |
| 0.9812500000000001 | 0 |
| 0.9819444444444444 | 0 |
| 0.9826388888888888 | 0 |
| 0.9833333333333334 | 0 |
| 0.9840277777777778 | 0 |
| 0.9847222222222222 | 0 |
| 0.9854166666666666 | 0 |
| 0.9861111111111112 | 0 |
| 0.9868055555555556 | 0 |
| 0.9874999999999999 | 0 |
| 0.9881944444444444 | 0 |
| 0.9888888888888889 | 0 |
| 0.9895833333333334 | 0 |
| 0.9902777777777777 | 0 |
| 0.9909722222222223 | 0 |
| 0.9916666666666667 | 0 |
| 0.9923611111111111 | 0 |
| 0.9930555555555555 | 0 |
| 0.99375 | 0 |
| 0.9944444444444445 | 0 |
| 0.9951388888888889 | 0 |
| 0.9958333333333332 | 0 |
| 0.9965277777777778 | 0 |
| 0.9972222222222222 | 0 |
| 0.9979166666666667 | 0 |
| 0.998611111111111 | 0 |
| 0.9993055555555556 | 0 |